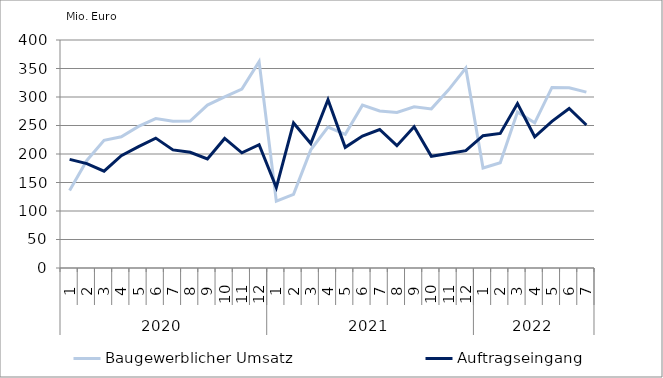
| Category | Baugewerblicher Umsatz | Auftragseingang |
|---|---|---|
| 0 | 136135.432 | 190647.086 |
| 1 | 188682.361 | 183141.14 |
| 2 | 224009.315 | 169770.009 |
| 3 | 230172.252 | 196979.845 |
| 4 | 248410.714 | 212955.83 |
| 5 | 262078.128 | 227853.487 |
| 6 | 257360.37 | 207209.188 |
| 7 | 257932.168 | 202976.091 |
| 8 | 285866.269 | 191463.844 |
| 9 | 300164.57 | 227245.467 |
| 10 | 313922.518 | 202060.636 |
| 11 | 362040.738 | 216296.504 |
| 12 | 117421.805 | 141020.655 |
| 13 | 129162.55 | 254416.876 |
| 14 | 207280.837 | 218451.405 |
| 15 | 247094.279 | 295077.868 |
| 16 | 234515.312 | 211696.129 |
| 17 | 285732.845 | 231455.155 |
| 18 | 275480.885 | 242932.505 |
| 19 | 272787.524 | 214636.944 |
| 20 | 282850.254 | 247827.991 |
| 21 | 279173.21 | 196069.238 |
| 22 | 312511.437 | 201015.897 |
| 23 | 350582.01 | 205949.991 |
| 24 | 175456.852 | 232178.255 |
| 25 | 184578.32 | 236006.862 |
| 26 | 273732.567 | 288451.109 |
| 27 | 254683.671 | 230228.968 |
| 28 | 316794.568 | 257235.39 |
| 29 | 316277.567 | 279900.179 |
| 30 | 308621.034 | 250827.343 |